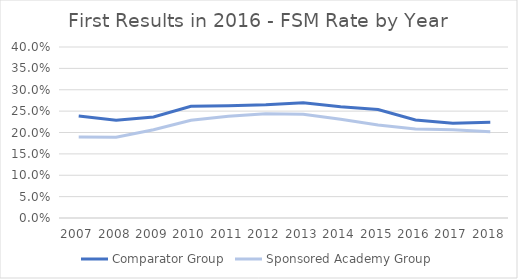
| Category | Comparator Group | Sponsored Academy Group |
|---|---|---|
| 2007.0 | 0.238 | 0.19 |
| 2008.0 | 0.228 | 0.189 |
| 2009.0 | 0.236 | 0.206 |
| 2010.0 | 0.261 | 0.229 |
| 2011.0 | 0.263 | 0.238 |
| 2012.0 | 0.265 | 0.244 |
| 2013.0 | 0.269 | 0.243 |
| 2014.0 | 0.26 | 0.231 |
| 2015.0 | 0.254 | 0.217 |
| 2016.0 | 0.229 | 0.208 |
| 2017.0 | 0.222 | 0.207 |
| 2018.0 | 0.224 | 0.202 |